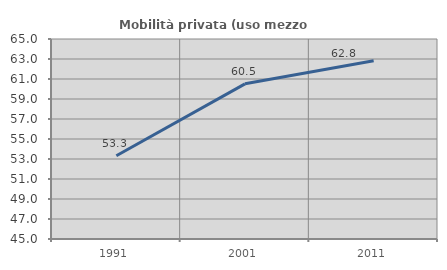
| Category | Mobilità privata (uso mezzo privato) |
|---|---|
| 1991.0 | 53.319 |
| 2001.0 | 60.518 |
| 2011.0 | 62.822 |